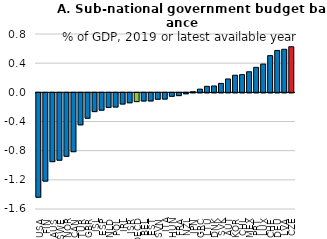
| Category | Subnational government |
|---|---|
| USA | -1.431 |
| FIN | -1.21 |
| AUS | -0.944 |
| SWE | -0.924 |
| NOR | -0.87 |
| CAN | -0.807 |
| TUR | -0.438 |
| GBR | -0.348 |
| ISL | -0.257 |
| ESP | -0.237 |
| NLD | -0.2 |
| POL | -0.194 |
| IRL | -0.153 |
| ISR | -0.136 |
| OECD | -0.12 |
| BEL | -0.112 |
| EST | -0.111 |
| SVN | -0.088 |
| ITA | -0.085 |
| HUN | -0.047 |
| FRA | -0.038 |
| NZL | -0.013 |
| JPN | 0.008 |
| GRC | 0.044 |
| LTU | 0.082 |
| DNK | 0.087 |
| SVK | 0.123 |
| AUT | 0.183 |
| KOR | 0.235 |
| CHL | 0.243 |
| MEX | 0.282 |
| PRT | 0.343 |
| LUX | 0.388 |
| CHE | 0.503 |
| DEU | 0.575 |
| LVA | 0.59 |
| CZE | 0.625 |